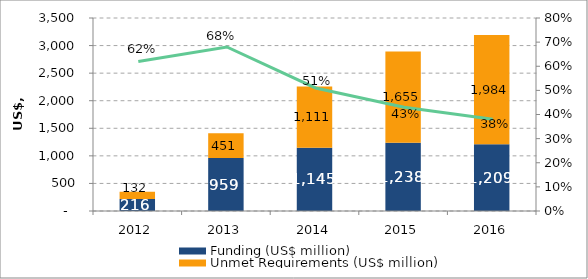
| Category | Funding (US$ million) | Unmet Requirements (US$ million) |
|---|---|---|
| 2012.0 | 215.915 | 132.425 |
| 2013.0 | 959.285 | 450.528 |
| 2014.0 | 1144.765 | 1111.434 |
| 2015.0 | 1238.159 | 1655.286 |
| 2016.0 | 1209.198 | 1984.472 |